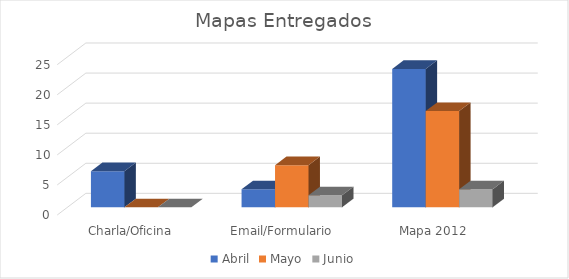
| Category | Abril | Mayo | Junio |
|---|---|---|---|
| Charla/Oficina | 6 | 0 | 0 |
| Email/Formulario | 3 | 7 | 2 |
| Mapa 2012 | 23 | 16 | 3 |